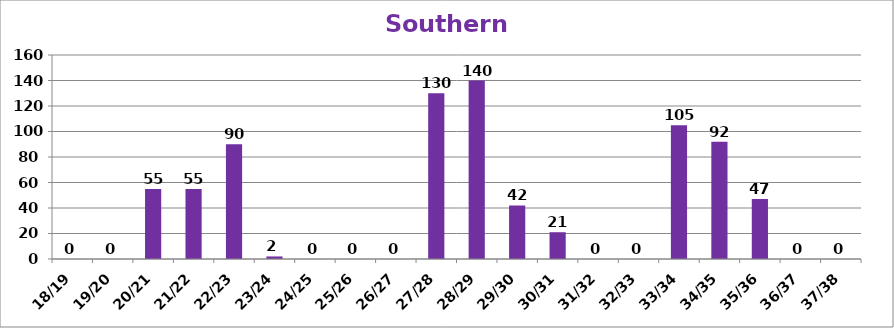
| Category | Southern Gateway |
|---|---|
| 18/19 | 0 |
| 19/20 | 0 |
| 20/21 | 55 |
| 21/22 | 55 |
| 22/23 | 90 |
| 23/24 | 2 |
| 24/25 | 0 |
| 25/26 | 0 |
| 26/27 | 0 |
| 27/28 | 130 |
| 28/29 | 140 |
| 29/30 | 42 |
| 30/31 | 21 |
| 31/32 | 0 |
| 32/33 | 0 |
| 33/34 | 105 |
| 34/35 | 92 |
| 35/36 | 47 |
| 36/37 | 0 |
| 37/38 | 0 |